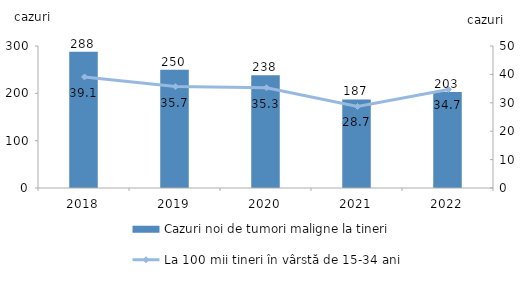
| Category | Cazuri noi de tumori maligne la tineri |
|---|---|
| 2018.0 | 288 |
| 2019.0 | 250 |
| 2020.0 | 238 |
| 2021.0 | 187 |
| 2022.0 | 203 |